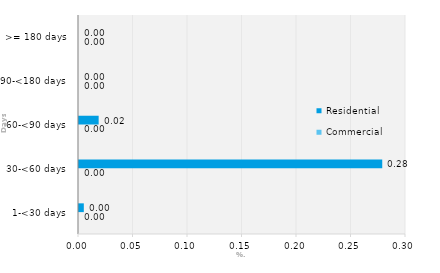
| Category | Commercial | Residential |
|---|---|---|
| 1-<30 days | 0 | 0.004 |
| 30-<60 days | 0 | 0.278 |
| 60-<90 days | 0 | 0.018 |
| 90-<180 days | 0 | 0 |
| >= 180 days | 0 | 0 |